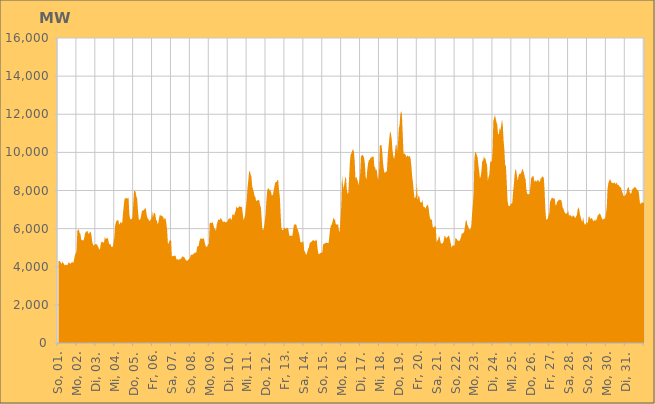
| Category | Series 0 |
|---|---|
|  So, 01.  | 4293.138 |
|  So, 01.  | 4305.622 |
|  So, 01.  | 4297.069 |
|  So, 01.  | 4215.127 |
|  So, 01.  | 4138.953 |
|  So, 01.  | 4272.709 |
|  So, 01.  | 4201.774 |
|  So, 01.  | 4158.555 |
|  So, 01.  | 4063.548 |
|  So, 01.  | 4110.044 |
|  So, 01.  | 4095.093 |
|  So, 01.  | 4094.536 |
|  So, 01.  | 4130.535 |
|  So, 01.  | 4237.282 |
|  So, 01.  | 4197.802 |
|  So, 01.  | 4157.958 |
|  So, 01.  | 4182.325 |
|  Mo, 02.  | 4230.7 |
|  Mo, 02.  | 4231.863 |
|  Mo, 02.  | 4207.417 |
|  Mo, 02.  | 4394.503 |
|  Mo, 02.  | 4605.674 |
|  Mo, 02.  | 4698.685 |
|  Mo, 02.  | 4791.669 |
|  Mo, 02.  | 5862.509 |
|  Mo, 02.  | 5948.268 |
|  Mo, 02.  | 5935.539 |
|  Mo, 02.  | 5766.187 |
|  Mo, 02.  | 5719.428 |
|  Mo, 02.  | 5401.02 |
|  Mo, 02.  | 5414.035 |
|  Mo, 02.  | 5371.289 |
|  Mo, 02.  | 5396.463 |
|  Mo, 02.  | 5551.307 |
|  Mo, 02.  | 5805.281 |
|  Mo, 02.  | 5791.399 |
|  Mo, 02.  | 5871.149 |
|  Mo, 02.  | 5877.101 |
|  Mo, 02.  | 5732.041 |
|  Mo, 02.  | 5744.409 |
|  Mo, 02.  | 5821.11 |
|  Di, 03.  | 5840.583 |
|  Di, 03.  | 5646.057 |
|  Di, 03.  | 5279.29 |
|  Di, 03.  | 5174.923 |
|  Di, 03.  | 5097.321 |
|  Di, 03.  | 5157.778 |
|  Di, 03.  | 5202.671 |
|  Di, 03.  | 5180.801 |
|  Di, 03.  | 5167.467 |
|  Di, 03.  | 5089.883 |
|  Di, 03.  | 4999.247 |
|  Di, 03.  | 4885.396 |
|  Di, 03.  | 4983.772 |
|  Di, 03.  | 5256.136 |
|  Di, 03.  | 5304.102 |
|  Di, 03.  | 5312.978 |
|  Di, 03.  | 5252.983 |
|  Di, 03.  | 5302.443 |
|  Di, 03.  | 5567.734 |
|  Di, 03.  | 5454.02 |
|  Di, 03.  | 5478.16 |
|  Di, 03.  | 5521.939 |
|  Di, 03.  | 5460.347 |
|  Di, 03.  | 5257.539 |
|  Mi, 04.  | 5174.031 |
|  Mi, 04.  | 5188.924 |
|  Mi, 04.  | 5056.621 |
|  Mi, 04.  | 5044.038 |
|  Mi, 04.  | 5044.257 |
|  Mi, 04.  | 5246.004 |
|  Mi, 04.  | 5549.512 |
|  Mi, 04.  | 6153.299 |
|  Mi, 04.  | 6326.841 |
|  Mi, 04.  | 6431.108 |
|  Mi, 04.  | 6435.082 |
|  Mi, 04.  | 6455.539 |
|  Mi, 04.  | 6218.516 |
|  Mi, 04.  | 6253.001 |
|  Mi, 04.  | 6345.965 |
|  Mi, 04.  | 6306.08 |
|  Mi, 04.  | 6298.979 |
|  Mi, 04.  | 6797.438 |
|  Mi, 04.  | 7205.24 |
|  Mi, 04.  | 7586.407 |
|  Mi, 04.  | 7561.044 |
|  Mi, 04.  | 7618.968 |
|  Mi, 04.  | 7606.898 |
|  Mi, 04.  | 7563.033 |
|  Do, 05.  | 7652.887 |
|  Do, 05.  | 6786.391 |
|  Do, 05.  | 6521.409 |
|  Do, 05.  | 6488.465 |
|  Do, 05.  | 6493.146 |
|  Do, 05.  | 6592.77 |
|  Do, 05.  | 7280.054 |
|  Do, 05.  | 7991.868 |
|  Do, 05.  | 7980.947 |
|  Do, 05.  | 7925.924 |
|  Do, 05.  | 7684.515 |
|  Do, 05.  | 7567.711 |
|  Do, 05.  | 6930.166 |
|  Do, 05.  | 6496.769 |
|  Do, 05.  | 6449.392 |
|  Do, 05.  | 6509.276 |
|  Do, 05.  | 6671.44 |
|  Do, 05.  | 6916.191 |
|  Do, 05.  | 6960.789 |
|  Do, 05.  | 6954.55 |
|  Do, 05.  | 7003.898 |
|  Do, 05.  | 7067.354 |
|  Do, 05.  | 7058.293 |
|  Do, 05.  | 6734.996 |
|  Fr, 06.  | 6550.121 |
|  Fr, 06.  | 6530.719 |
|  Fr, 06.  | 6414.178 |
|  Fr, 06.  | 6400.109 |
|  Fr, 06.  | 6471.749 |
|  Fr, 06.  | 6529.127 |
|  Fr, 06.  | 6890.091 |
|  Fr, 06.  | 6572.535 |
|  Fr, 06.  | 6817.317 |
|  Fr, 06.  | 6827.823 |
|  Fr, 06.  | 6759.762 |
|  Fr, 06.  | 6455.098 |
|  Fr, 06.  | 6422.993 |
|  Fr, 06.  | 6220.883 |
|  Fr, 06.  | 6338.895 |
|  Fr, 06.  | 6597.688 |
|  Fr, 06.  | 6747.833 |
|  Fr, 06.  | 6660.226 |
|  Fr, 06.  | 6687.866 |
|  Fr, 06.  | 6645.821 |
|  Fr, 06.  | 6615.882 |
|  Fr, 06.  | 6457.297 |
|  Fr, 06.  | 6565.714 |
|  Fr, 06.  | 6514.552 |
|  Sa, 07.  | 6287.632 |
|  Sa, 07.  | 5943.785 |
|  Sa, 07.  | 5221.599 |
|  Sa, 07.  | 5222.849 |
|  Sa, 07.  | 5378.169 |
|  Sa, 07.  | 5381.323 |
|  Sa, 07.  | 5408.942 |
|  Sa, 07.  | 4545.43 |
|  Sa, 07.  | 4556.574 |
|  Sa, 07.  | 4559.723 |
|  Sa, 07.  | 4562.437 |
|  Sa, 07.  | 4601.532 |
|  Sa, 07.  | 4539.494 |
|  Sa, 07.  | 4369.568 |
|  Sa, 07.  | 4392.674 |
|  Sa, 07.  | 4387.975 |
|  Sa, 07.  | 4343.1 |
|  Sa, 07.  | 4422.071 |
|  Sa, 07.  | 4384.446 |
|  Sa, 07.  | 4453.029 |
|  Sa, 07.  | 4525.364 |
|  Sa, 07.  | 4542.415 |
|  Sa, 07.  | 4511.097 |
|  Sa, 07.  | 4482.389 |
|  So, 08.  | 4403.445 |
|  So, 08.  | 4320.594 |
|  So, 08.  | 4322.499 |
|  So, 08.  | 4326.282 |
|  So, 08.  | 4370.816 |
|  So, 08.  | 4425.794 |
|  So, 08.  | 4470.371 |
|  So, 08.  | 4630.954 |
|  So, 08.  | 4626.481 |
|  So, 08.  | 4637.316 |
|  So, 08.  | 4648.912 |
|  So, 08.  | 4693.948 |
|  So, 08.  | 4725.702 |
|  So, 08.  | 4750.855 |
|  So, 08.  | 4738.324 |
|  So, 08.  | 5010.72 |
|  So, 08.  | 5085.396 |
|  So, 08.  | 5081.899 |
|  So, 08.  | 5338.154 |
|  So, 08.  | 5460.31 |
|  So, 08.  | 5506.981 |
|  So, 08.  | 5456.446 |
|  So, 08.  | 5466.195 |
|  So, 08.  | 5505.702 |
|  Mo, 09.  | 5428.516 |
|  Mo, 09.  | 5221.542 |
|  Mo, 09.  | 5085.42 |
|  Mo, 09.  | 5036.874 |
|  Mo, 09.  | 5063.748 |
|  Mo, 09.  | 5204.466 |
|  Mo, 09.  | 5178.55 |
|  Mo, 09.  | 6301.592 |
|  Mo, 09.  | 6306.471 |
|  Mo, 09.  | 6286.777 |
|  Mo, 09.  | 6316.07 |
|  Mo, 09.  | 6328.882 |
|  Mo, 09.  | 6154.257 |
|  Mo, 09.  | 5993.121 |
|  Mo, 09.  | 5980.792 |
|  Mo, 09.  | 5868.108 |
|  Mo, 09.  | 6217.208 |
|  Mo, 09.  | 6351.405 |
|  Mo, 09.  | 6494.149 |
|  Mo, 09.  | 6461.902 |
|  Mo, 09.  | 6448.028 |
|  Mo, 09.  | 6570.193 |
|  Mo, 09.  | 6499.34 |
|  Mo, 09.  | 6420.076 |
|  Di, 10.  | 6329.261 |
|  Di, 10.  | 6380.874 |
|  Di, 10.  | 6369.536 |
|  Di, 10.  | 6334.428 |
|  Di, 10.  | 6317.064 |
|  Di, 10.  | 6372.941 |
|  Di, 10.  | 6413.249 |
|  Di, 10.  | 6522.778 |
|  Di, 10.  | 6506.365 |
|  Di, 10.  | 6594.793 |
|  Di, 10.  | 6480.037 |
|  Di, 10.  | 6464.214 |
|  Di, 10.  | 6777.33 |
|  Di, 10.  | 6728.638 |
|  Di, 10.  | 6682.701 |
|  Di, 10.  | 6835.762 |
|  Di, 10.  | 6934.943 |
|  Di, 10.  | 7189.761 |
|  Di, 10.  | 7055.927 |
|  Di, 10.  | 7111.438 |
|  Di, 10.  | 7127.463 |
|  Di, 10.  | 7186.512 |
|  Di, 10.  | 7156.757 |
|  Di, 10.  | 7129.759 |
|  Mi, 11.  | 7134.191 |
|  Mi, 11.  | 6776.337 |
|  Mi, 11.  | 6445.592 |
|  Mi, 11.  | 6556.607 |
|  Mi, 11.  | 6731.733 |
|  Mi, 11.  | 7148.53 |
|  Mi, 11.  | 7498.058 |
|  Mi, 11.  | 8136.85 |
|  Mi, 11.  | 8512.846 |
|  Mi, 11.  | 8973.152 |
|  Mi, 11.  | 9030.681 |
|  Mi, 11.  | 8830.897 |
|  Mi, 11.  | 8713.838 |
|  Mi, 11.  | 8212.617 |
|  Mi, 11.  | 8065.072 |
|  Mi, 11.  | 7914.329 |
|  Mi, 11.  | 7706.133 |
|  Mi, 11.  | 7656.751 |
|  Mi, 11.  | 7439.436 |
|  Mi, 11.  | 7467.346 |
|  Mi, 11.  | 7507.94 |
|  Mi, 11.  | 7496.049 |
|  Mi, 11.  | 7466.924 |
|  Mi, 11.  | 7224.523 |
|  Do, 12.  | 7108.093 |
|  Do, 12.  | 6486.806 |
|  Do, 12.  | 5953.021 |
|  Do, 12.  | 5933.363 |
|  Do, 12.  | 6082.437 |
|  Do, 12.  | 6429.413 |
|  Do, 12.  | 6762.394 |
|  Do, 12.  | 7467.113 |
|  Do, 12.  | 7988.198 |
|  Do, 12.  | 8124.387 |
|  Do, 12.  | 8093.794 |
|  Do, 12.  | 8018.21 |
|  Do, 12.  | 8035.372 |
|  Do, 12.  | 7895.138 |
|  Do, 12.  | 7716.042 |
|  Do, 12.  | 7773.976 |
|  Do, 12.  | 7933.119 |
|  Do, 12.  | 8169.342 |
|  Do, 12.  | 8394.39 |
|  Do, 12.  | 8444.57 |
|  Do, 12.  | 8450.654 |
|  Do, 12.  | 8560.221 |
|  Do, 12.  | 8544.959 |
|  Do, 12.  | 8030.778 |
|  Fr, 13.  | 7693.572 |
|  Fr, 13.  | 6814.979 |
|  Fr, 13.  | 6071.692 |
|  Fr, 13.  | 5924.995 |
|  Fr, 13.  | 5916.585 |
|  Fr, 13.  | 5991.445 |
|  Fr, 13.  | 6077.193 |
|  Fr, 13.  | 5983.402 |
|  Fr, 13.  | 6011.961 |
|  Fr, 13.  | 6021.07 |
|  Fr, 13.  | 6047.584 |
|  Fr, 13.  | 5920.89 |
|  Fr, 13.  | 5649.145 |
|  Fr, 13.  | 5610.778 |
|  Fr, 13.  | 5644.66 |
|  Fr, 13.  | 5618.479 |
|  Fr, 13.  | 5629.018 |
|  Fr, 13.  | 5927.026 |
|  Fr, 13.  | 6236.035 |
|  Fr, 13.  | 6192.089 |
|  Fr, 13.  | 6229.006 |
|  Fr, 13.  | 6218.211 |
|  Fr, 13.  | 5988.912 |
|  Fr, 13.  | 5946.774 |
|  Sa, 14.  | 5785.865 |
|  Sa, 14.  | 5633.252 |
|  Sa, 14.  | 5310.469 |
|  Sa, 14.  | 5274.839 |
|  Sa, 14.  | 5290.705 |
|  Sa, 14.  | 5289.461 |
|  Sa, 14.  | 5351.344 |
|  Sa, 14.  | 4835.961 |
|  Sa, 14.  | 4799.427 |
|  Sa, 14.  | 4663.186 |
|  Sa, 14.  | 4632.493 |
|  Sa, 14.  | 4807.325 |
|  Sa, 14.  | 4949.066 |
|  Sa, 14.  | 5017.948 |
|  Sa, 14.  | 5258.029 |
|  Sa, 14.  | 5280.181 |
|  Sa, 14.  | 5297.951 |
|  Sa, 14.  | 5359.343 |
|  Sa, 14.  | 5380.03 |
|  Sa, 14.  | 5400.566 |
|  Sa, 14.  | 5339.027 |
|  Sa, 14.  | 5359.156 |
|  Sa, 14.  | 5425.482 |
|  Sa, 14.  | 5365.602 |
|  So, 15.  | 4937.52 |
|  So, 15.  | 4679.806 |
|  So, 15.  | 4649.264 |
|  So, 15.  | 4722.783 |
|  So, 15.  | 4715.698 |
|  So, 15.  | 4733.573 |
|  So, 15.  | 4755.505 |
|  So, 15.  | 5167.044 |
|  So, 15.  | 5201.685 |
|  So, 15.  | 5221.468 |
|  So, 15.  | 5249.421 |
|  So, 15.  | 5258.125 |
|  So, 15.  | 5260.38 |
|  So, 15.  | 5239.598 |
|  So, 15.  | 5258.034 |
|  So, 15.  | 5649.2 |
|  So, 15.  | 6018.514 |
|  So, 15.  | 6153.085 |
|  So, 15.  | 6220.814 |
|  So, 15.  | 6377.279 |
|  So, 15.  | 6579.236 |
|  So, 15.  | 6469.346 |
|  So, 15.  | 6494.383 |
|  So, 15.  | 6250.169 |
|  Mo, 16.  | 6217.043 |
|  Mo, 16.  | 6195.222 |
|  Mo, 16.  | 6238.011 |
|  Mo, 16.  | 5924.573 |
|  Mo, 16.  | 5818.062 |
|  Mo, 16.  | 6477.107 |
|  Mo, 16.  | 7162.843 |
|  Mo, 16.  | 8796.324 |
|  Mo, 16.  | 8358.813 |
|  Mo, 16.  | 8080.364 |
|  Mo, 16.  | 8375.458 |
|  Mo, 16.  | 8647.455 |
|  Mo, 16.  | 8726.976 |
|  Mo, 16.  | 8063.234 |
|  Mo, 16.  | 7826.718 |
|  Mo, 16.  | 7872.123 |
|  Mo, 16.  | 8696.905 |
|  Mo, 16.  | 9508.374 |
|  Mo, 16.  | 9910.285 |
|  Mo, 16.  | 9955.391 |
|  Mo, 16.  | 10100.121 |
|  Mo, 16.  | 10170.68 |
|  Mo, 16.  | 10035.74 |
|  Mo, 16.  | 9587.234 |
|  Di, 17.  | 8606.25 |
|  Di, 17.  | 8734.25 |
|  Di, 17.  | 8607.089 |
|  Di, 17.  | 8484.25 |
|  Di, 17.  | 8277.573 |
|  Di, 17.  | 8533.751 |
|  Di, 17.  | 8897.738 |
|  Di, 17.  | 9816.354 |
|  Di, 17.  | 9836.283 |
|  Di, 17.  | 9863.987 |
|  Di, 17.  | 9815.655 |
|  Di, 17.  | 9712.257 |
|  Di, 17.  | 9402.082 |
|  Di, 17.  | 8705.525 |
|  Di, 17.  | 8572.732 |
|  Di, 17.  | 9076.59 |
|  Di, 17.  | 9415.215 |
|  Di, 17.  | 9579.386 |
|  Di, 17.  | 9617.852 |
|  Di, 17.  | 9703.052 |
|  Di, 17.  | 9714.16 |
|  Di, 17.  | 9789.704 |
|  Di, 17.  | 9762.871 |
|  Di, 17.  | 9784.825 |
|  Mi, 18.  | 9260.397 |
|  Mi, 18.  | 9211.129 |
|  Mi, 18.  | 9035.904 |
|  Mi, 18.  | 9119.929 |
|  Mi, 18.  | 8730.101 |
|  Mi, 18.  | 8535.893 |
|  Mi, 18.  | 9024.193 |
|  Mi, 18.  | 10345.779 |
|  Mi, 18.  | 10380.675 |
|  Mi, 18.  | 10389.963 |
|  Mi, 18.  | 10046.153 |
|  Mi, 18.  | 9461.809 |
|  Mi, 18.  | 9103.54 |
|  Mi, 18.  | 8921.683 |
|  Mi, 18.  | 8959.866 |
|  Mi, 18.  | 8982.657 |
|  Mi, 18.  | 9034.812 |
|  Mi, 18.  | 9853.31 |
|  Mi, 18.  | 10279.73 |
|  Mi, 18.  | 10744.68 |
|  Mi, 18.  | 11110.111 |
|  Mi, 18.  | 10986.904 |
|  Mi, 18.  | 10709.221 |
|  Mi, 18.  | 10118.371 |
|  Do, 19.  | 9817.703 |
|  Do, 19.  | 9656.682 |
|  Do, 19.  | 9858.091 |
|  Do, 19.  | 10349.183 |
|  Do, 19.  | 10435.918 |
|  Do, 19.  | 10008.645 |
|  Do, 19.  | 10436.421 |
|  Do, 19.  | 11233.458 |
|  Do, 19.  | 11438.332 |
|  Do, 19.  | 11986.536 |
|  Do, 19.  | 12183.715 |
|  Do, 19.  | 11973.293 |
|  Do, 19.  | 10981.987 |
|  Do, 19.  | 9948.788 |
|  Do, 19.  | 9930.989 |
|  Do, 19.  | 9925.933 |
|  Do, 19.  | 9838.749 |
|  Do, 19.  | 9739.607 |
|  Do, 19.  | 9865.201 |
|  Do, 19.  | 9768.961 |
|  Do, 19.  | 9796.992 |
|  Do, 19.  | 9813.273 |
|  Do, 19.  | 9670.241 |
|  Do, 19.  | 9286.744 |
|  Fr, 20.  | 8749.85 |
|  Fr, 20.  | 8411.455 |
|  Fr, 20.  | 7959.951 |
|  Fr, 20.  | 7593.038 |
|  Fr, 20.  | 7611.372 |
|  Fr, 20.  | 7763.544 |
|  Fr, 20.  | 8375.054 |
|  Fr, 20.  | 7486.632 |
|  Fr, 20.  | 7724.117 |
|  Fr, 20.  | 7700.166 |
|  Fr, 20.  | 7411.623 |
|  Fr, 20.  | 7367.281 |
|  Fr, 20.  | 7367.762 |
|  Fr, 20.  | 7517.119 |
|  Fr, 20.  | 7189.269 |
|  Fr, 20.  | 7113.808 |
|  Fr, 20.  | 7138.021 |
|  Fr, 20.  | 7037.424 |
|  Fr, 20.  | 7181.695 |
|  Fr, 20.  | 7214.392 |
|  Fr, 20.  | 7273.699 |
|  Fr, 20.  | 7036.092 |
|  Fr, 20.  | 6679.478 |
|  Fr, 20.  | 6515.726 |
|  Sa, 21.  | 6450.094 |
|  Sa, 21.  | 6497.589 |
|  Sa, 21.  | 6106.283 |
|  Sa, 21.  | 6046.871 |
|  Sa, 21.  | 6083.279 |
|  Sa, 21.  | 6145.58 |
|  Sa, 21.  | 6093.414 |
|  Sa, 21.  | 5295.053 |
|  Sa, 21.  | 5383.63 |
|  Sa, 21.  | 5429.671 |
|  Sa, 21.  | 5609.377 |
|  Sa, 21.  | 5542.855 |
|  Sa, 21.  | 5286.488 |
|  Sa, 21.  | 5211.942 |
|  Sa, 21.  | 5224.086 |
|  Sa, 21.  | 5242.813 |
|  Sa, 21.  | 5344.922 |
|  Sa, 21.  | 5617.487 |
|  Sa, 21.  | 5614.63 |
|  Sa, 21.  | 5458.36 |
|  Sa, 21.  | 5544.979 |
|  Sa, 21.  | 5564.847 |
|  Sa, 21.  | 5645.345 |
|  Sa, 21.  | 5593.258 |
|  So, 22.  | 5407.41 |
|  So, 22.  | 5218.209 |
|  So, 22.  | 5003.26 |
|  So, 22.  | 5095.983 |
|  So, 22.  | 5112.17 |
|  So, 22.  | 5117.379 |
|  So, 22.  | 5108.704 |
|  So, 22.  | 5530.97 |
|  So, 22.  | 5480.046 |
|  So, 22.  | 5432.474 |
|  So, 22.  | 5365.432 |
|  So, 22.  | 5354.004 |
|  So, 22.  | 5353.285 |
|  So, 22.  | 5448.118 |
|  So, 22.  | 5538.471 |
|  So, 22.  | 5774.246 |
|  So, 22.  | 5731.542 |
|  So, 22.  | 5772.325 |
|  So, 22.  | 5844.698 |
|  So, 22.  | 6132.772 |
|  So, 22.  | 6413.059 |
|  So, 22.  | 6448.371 |
|  So, 22.  | 6207.664 |
|  So, 22.  | 6138.772 |
|  Mo, 23.  | 5971.599 |
|  Mo, 23.  | 5973.702 |
|  Mo, 23.  | 5963.148 |
|  Mo, 23.  | 6142.502 |
|  Mo, 23.  | 6760.987 |
|  Mo, 23.  | 7259.077 |
|  Mo, 23.  | 7880.939 |
|  Mo, 23.  | 9664.865 |
|  Mo, 23.  | 10035.961 |
|  Mo, 23.  | 9990.349 |
|  Mo, 23.  | 9858.025 |
|  Mo, 23.  | 9744.419 |
|  Mo, 23.  | 9334.971 |
|  Mo, 23.  | 9031.376 |
|  Mo, 23.  | 8635.132 |
|  Mo, 23.  | 8732.126 |
|  Mo, 23.  | 9043.231 |
|  Mo, 23.  | 9566.892 |
|  Mo, 23.  | 9560.916 |
|  Mo, 23.  | 9780.927 |
|  Mo, 23.  | 9677.086 |
|  Mo, 23.  | 9685.055 |
|  Mo, 23.  | 9478.477 |
|  Mo, 23.  | 9334.057 |
|  Di, 24.  | 8518.781 |
|  Di, 24.  | 8700.483 |
|  Di, 24.  | 8869.834 |
|  Di, 24.  | 9461.696 |
|  Di, 24.  | 9571.407 |
|  Di, 24.  | 9474.763 |
|  Di, 24.  | 10016.662 |
|  Di, 24.  | 11643.943 |
|  Di, 24.  | 11784.868 |
|  Di, 24.  | 11978.162 |
|  Di, 24.  | 11770.303 |
|  Di, 24.  | 11584.929 |
|  Di, 24.  | 11446.089 |
|  Di, 24.  | 10968.851 |
|  Di, 24.  | 10952.476 |
|  Di, 24.  | 11282.176 |
|  Di, 24.  | 11160.843 |
|  Di, 24.  | 11399.683 |
|  Di, 24.  | 11729.249 |
|  Di, 24.  | 11439.241 |
|  Di, 24.  | 10640.656 |
|  Di, 24.  | 10152.501 |
|  Di, 24.  | 9346.173 |
|  Di, 24.  | 9285.56 |
|  Mi, 25.  | 8460.904 |
|  Mi, 25.  | 7489.881 |
|  Mi, 25.  | 7205.958 |
|  Mi, 25.  | 7190.658 |
|  Mi, 25.  | 7189.924 |
|  Mi, 25.  | 7274.39 |
|  Mi, 25.  | 7326.143 |
|  Mi, 25.  | 7325.77 |
|  Mi, 25.  | 7871.092 |
|  Mi, 25.  | 8294.575 |
|  Mi, 25.  | 8807.627 |
|  Mi, 25.  | 9118.546 |
|  Mi, 25.  | 9064.615 |
|  Mi, 25.  | 8761.878 |
|  Mi, 25.  | 8516.41 |
|  Mi, 25.  | 8753.287 |
|  Mi, 25.  | 8885.435 |
|  Mi, 25.  | 8862.783 |
|  Mi, 25.  | 8905.126 |
|  Mi, 25.  | 9016.395 |
|  Mi, 25.  | 9143.228 |
|  Mi, 25.  | 9041.074 |
|  Mi, 25.  | 8901.176 |
|  Mi, 25.  | 8686.472 |
|  Do, 26.  | 8571.756 |
|  Do, 26.  | 8017.894 |
|  Do, 26.  | 7817.765 |
|  Do, 26.  | 7822.761 |
|  Do, 26.  | 7793.224 |
|  Do, 26.  | 7815.546 |
|  Do, 26.  | 8188.853 |
|  Do, 26.  | 8620.77 |
|  Do, 26.  | 8734.546 |
|  Do, 26.  | 8734.929 |
|  Do, 26.  | 8763.623 |
|  Do, 26.  | 8469.876 |
|  Do, 26.  | 8472.8 |
|  Do, 26.  | 8556.254 |
|  Do, 26.  | 8436.804 |
|  Do, 26.  | 8545.029 |
|  Do, 26.  | 8552.206 |
|  Do, 26.  | 8445.633 |
|  Do, 26.  | 8473.307 |
|  Do, 26.  | 8617.068 |
|  Do, 26.  | 8659.237 |
|  Do, 26.  | 8749.742 |
|  Do, 26.  | 8696.072 |
|  Do, 26.  | 8687.75 |
|  Fr, 27.  | 8066.661 |
|  Fr, 27.  | 7046.636 |
|  Fr, 27.  | 6471.216 |
|  Fr, 27.  | 6497.364 |
|  Fr, 27.  | 6512.079 |
|  Fr, 27.  | 6681.284 |
|  Fr, 27.  | 6787.548 |
|  Fr, 27.  | 7414.111 |
|  Fr, 27.  | 7502.523 |
|  Fr, 27.  | 7604.566 |
|  Fr, 27.  | 7622.139 |
|  Fr, 27.  | 7571.962 |
|  Fr, 27.  | 7597.463 |
|  Fr, 27.  | 7562.515 |
|  Fr, 27.  | 7207.89 |
|  Fr, 27.  | 7246.14 |
|  Fr, 27.  | 7410.067 |
|  Fr, 27.  | 7434.11 |
|  Fr, 27.  | 7502.579 |
|  Fr, 27.  | 7518.384 |
|  Fr, 27.  | 7505.961 |
|  Fr, 27.  | 7504.45 |
|  Fr, 27.  | 7366.124 |
|  Fr, 27.  | 7095.478 |
|  Sa, 28.  | 7048.622 |
|  Sa, 28.  | 6901.077 |
|  Sa, 28.  | 6825.29 |
|  Sa, 28.  | 6771.822 |
|  Sa, 28.  | 6797.572 |
|  Sa, 28.  | 6834.041 |
|  Sa, 28.  | 6946.916 |
|  Sa, 28.  | 6675.767 |
|  Sa, 28.  | 6710.588 |
|  Sa, 28.  | 6701.246 |
|  Sa, 28.  | 6655.504 |
|  Sa, 28.  | 6602.623 |
|  Sa, 28.  | 6689.824 |
|  Sa, 28.  | 6679.741 |
|  Sa, 28.  | 6628.721 |
|  Sa, 28.  | 6546.816 |
|  Sa, 28.  | 6644.121 |
|  Sa, 28.  | 6697.321 |
|  Sa, 28.  | 6989.509 |
|  Sa, 28.  | 7123.176 |
|  Sa, 28.  | 7005.646 |
|  Sa, 28.  | 6741.089 |
|  Sa, 28.  | 6583.72 |
|  Sa, 28.  | 6428.826 |
|  So, 29.  | 6357.297 |
|  So, 29.  | 6602.781 |
|  So, 29.  | 6348.227 |
|  So, 29.  | 6213.252 |
|  So, 29.  | 6213.944 |
|  So, 29.  | 6336.383 |
|  So, 29.  | 6282.31 |
|  So, 29.  | 6347.841 |
|  So, 29.  | 6627.766 |
|  So, 29.  | 6637.283 |
|  So, 29.  | 6510.405 |
|  So, 29.  | 6522.79 |
|  So, 29.  | 6565.463 |
|  So, 29.  | 6466.212 |
|  So, 29.  | 6403.719 |
|  So, 29.  | 6383.688 |
|  So, 29.  | 6508.305 |
|  So, 29.  | 6401.661 |
|  So, 29.  | 6463.679 |
|  So, 29.  | 6615.011 |
|  So, 29.  | 6732.412 |
|  So, 29.  | 6733.83 |
|  So, 29.  | 6810.745 |
|  So, 29.  | 6740.659 |
|  So, 29.  | 6629.732 |
|  Mo, 30.  | 6520.345 |
|  Mo, 30.  | 6466.534 |
|  Mo, 30.  | 6509.029 |
|  Mo, 30.  | 6523.942 |
|  Mo, 30.  | 6535.282 |
|  Mo, 30.  | 6800.539 |
|  Mo, 30.  | 7137.936 |
|  Mo, 30.  | 8110.892 |
|  Mo, 30.  | 8388.976 |
|  Mo, 30.  | 8502.095 |
|  Mo, 30.  | 8597.236 |
|  Mo, 30.  | 8527.542 |
|  Mo, 30.  | 8417.184 |
|  Mo, 30.  | 8399.846 |
|  Mo, 30.  | 8377.399 |
|  Mo, 30.  | 8393.449 |
|  Mo, 30.  | 8438.499 |
|  Mo, 30.  | 8322.715 |
|  Mo, 30.  | 8414.039 |
|  Mo, 30.  | 8361.607 |
|  Mo, 30.  | 8277.911 |
|  Mo, 30.  | 8295.225 |
|  Mo, 30.  | 8230.355 |
|  Mo, 30.  | 8151.069 |
|  Di, 31.  | 8178.914 |
|  Di, 31.  | 7984.788 |
|  Di, 31.  | 7882.4 |
|  Di, 31.  | 7740.478 |
|  Di, 31.  | 7704.206 |
|  Di, 31.  | 7715.238 |
|  Di, 31.  | 7798.275 |
|  Di, 31.  | 7878.597 |
|  Di, 31.  | 8074.899 |
|  Di, 31.  | 8167.183 |
|  Di, 31.  | 8150.857 |
|  Di, 31.  | 7926.108 |
|  Di, 31.  | 7834.413 |
|  Di, 31.  | 7839.23 |
|  Di, 31.  | 7993.815 |
|  Di, 31.  | 8109.537 |
|  Di, 31.  | 8100.6 |
|  Di, 31.  | 8176.387 |
|  Di, 31.  | 8181.309 |
|  Di, 31.  | 8129.546 |
|  Di, 31.  | 8059.058 |
|  Di, 31.  | 8028.973 |
|  Di, 31.  | 8026.913 |
|  Di, 31.  | 7787.169 |
|  Mi, 01.  | 7374.795 |
|  Mi, 01.  | 7276.746 |
|  Mi, 01.  | 7372.054 |
|  Mi, 01.  | 7373.348 |
|  Mi, 01.  | 7344.315 |